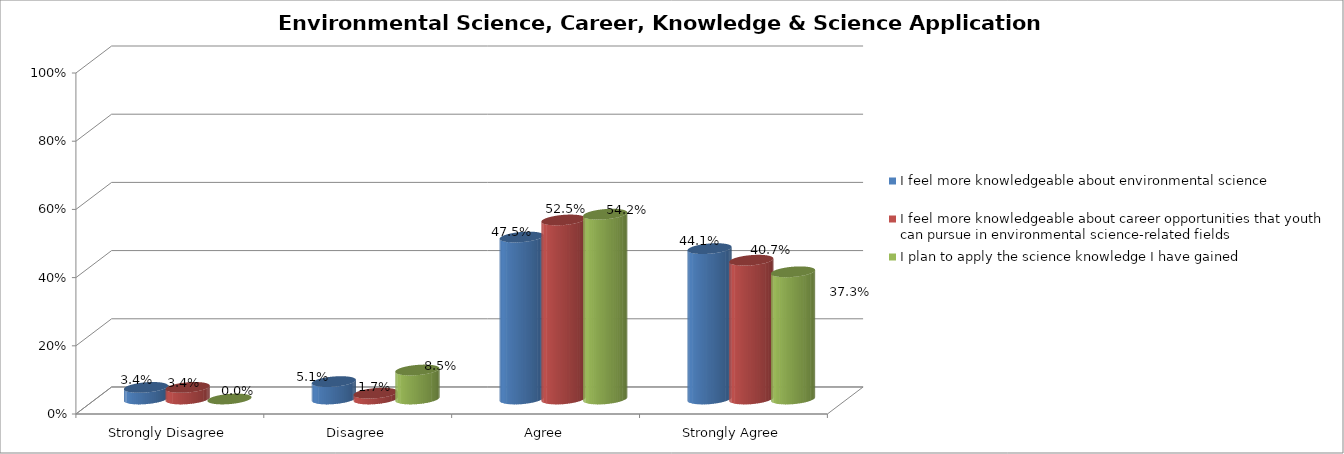
| Category | I feel more knowledgeable about environmental science | I feel more knowledgeable about career opportunities that youth can pursue in environmental science-related fields | I plan to apply the science knowledge I have gained |
|---|---|---|---|
| Strongly Disagree | 0.034 | 0.034 | 0 |
| Disagree | 0.051 | 0.017 | 0.085 |
| Agree | 0.475 | 0.525 | 0.542 |
| Strongly Agree | 0.441 | 0.407 | 0.373 |